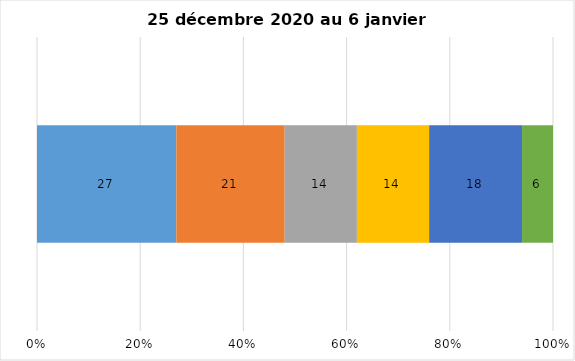
| Category | Plusieurs fois par jour | Une fois par jour | Quelques fois par semaine   | Une fois par semaine ou moins   |  Jamais   |  Je n’utilise pas les médias sociaux |
|---|---|---|---|---|---|---|
| 0 | 27 | 21 | 14 | 14 | 18 | 6 |